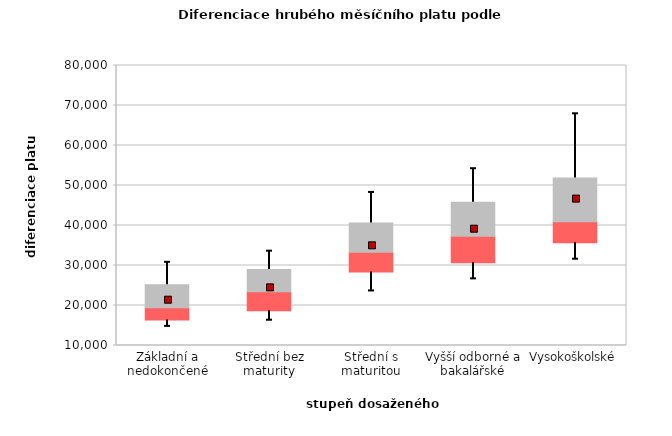
| Category | 0,25 | 0,5 | 0,75 |
|---|---|---|---|
| Základní a nedokončené | 16375.167 | 3035.774 | 5771.226 |
| Střední bez maturity | 18691.505 | 4749.328 | 5585.787 |
| Střední s maturitou | 28347.597 | 4976.072 | 7293.586 |
| Vyšší odborné a bakalářské | 30667.511 | 6629.07 | 8526.526 |
| Vysokoškolské | 35677.348 | 5239.99 | 10984.594 |